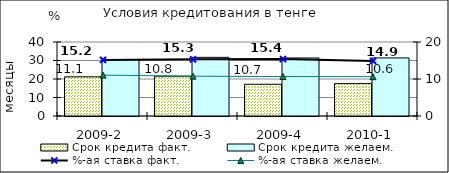
| Category | Срок кредита факт.  | Срок кредита желаем. |
|---|---|---|
| 2009-2 | 21.19 | 30.36 |
| 2009-3 | 21.5 | 31.7 |
| 2009-4 | 17.15 | 31.37 |
| 2010-1 | 17.5 | 31.4 |